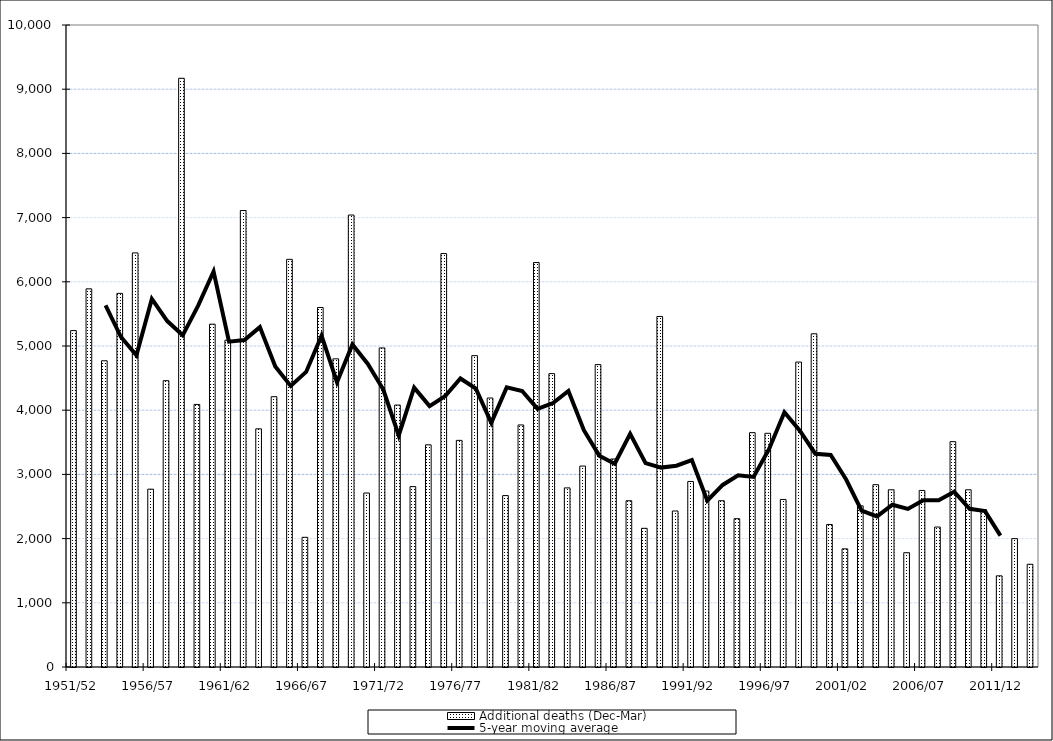
| Category | Additional deaths (Dec-Mar) |
|---|---|
| 1951/52 | 5240 |
| 1952/53 | 5890 |
| 1953/54 | 4770 |
| 1954/55 | 5820 |
| 1955/56 | 6450 |
| 1956/57 | 2770 |
| 1957/58 | 4460 |
| 1958/59 | 9170 |
| 1959/60 | 4090 |
| 1960/61 | 5340 |
| 1961/62 | 5090 |
| 1962/63 | 7110 |
| 1963/64 | 3710 |
| 1964/65 | 4210 |
| 1965/66 | 6350 |
| 1966/67 | 2020 |
| 1967/68 | 5600 |
| 1968/69 | 4800 |
| 1969/70 | 7040 |
| 1970/71 | 2710 |
| 1971/72 | 4970 |
| 1972/73 | 4080 |
| 1973/74 | 2810 |
| 1974/75 | 3460 |
| 1975/76 | 6440 |
| 1976/77 | 3530 |
| 1977/78 | 4850 |
| 1978/79 | 4190 |
| 1979/80 | 2670 |
| 1980/81 | 3770 |
| 1981/82 | 6300 |
| 1982/83 | 4570 |
| 1983/84 | 2790 |
| 1984/85 | 3130 |
| 1985/86 | 4710 |
| 1986/87 | 3240 |
| 1987/88 | 2590 |
| 1988/89 | 2160 |
| 1989/90 | 5460 |
| 1990/91 | 2430 |
| 1991/92 | 2890 |
| 1992/93 | 2740 |
| 1993/94 | 2590 |
| 1994/95 | 2310 |
| 1995/96 | 3650 |
| 1996/97 | 3640 |
| 1997/98 | 2610 |
| 1998/99 | 4750 |
| 1999/00 | 5190 |
| 2000/01 | 2220 |
| 2001/02 | 1840 |
| 2002/03 | 2510 |
| 2003/04 | 2840 |
| 2004/05 | 2760 |
| 2005/06 | 1780 |
| 2006/07 | 2750 |
| 2007/08 | 2180 |
| 2008/09 | 3510 |
| 2009/10  | 2760 |
| 2010/11 | 2450 |
| 2011/12 | 1420 |
| 2012/13 | 2000 |
| 2013/14  prov. | 1600 |